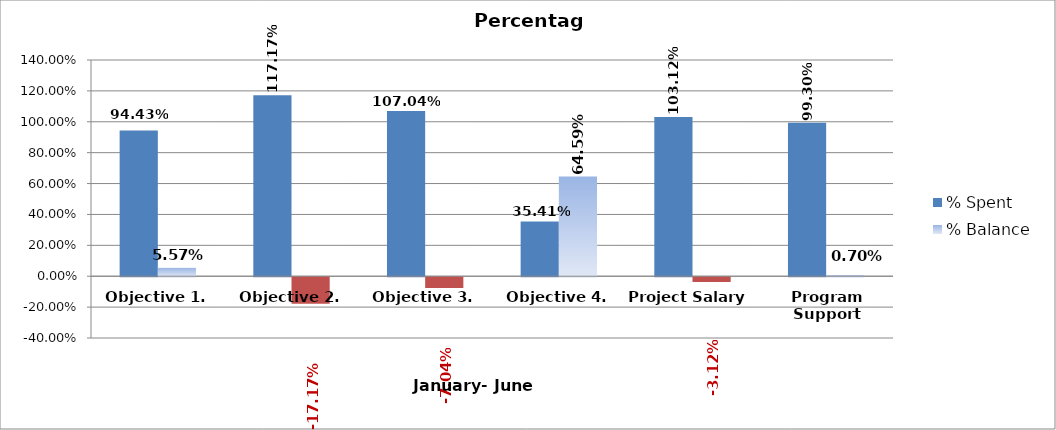
| Category | % Spent  | % Balance  |
|---|---|---|
| Objective 1. | 0.944 | 0.056 |
| Objective 2. | 1.172 | -0.172 |
| Objective 3. | 1.07 | -0.07 |
| Objective 4. | 0.354 | 0.646 |
| Project Salary  | 1.031 | -0.031 |
| Program Support | 0.993 | 0.007 |